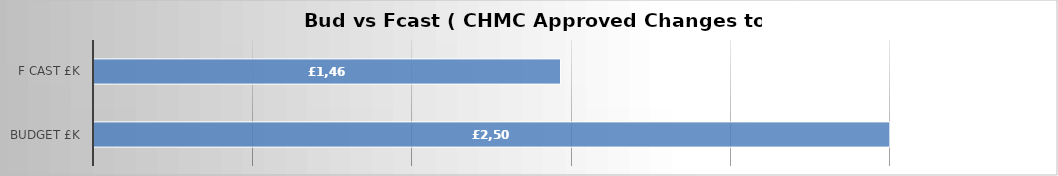
| Category | Series 0 |
|---|---|
| Budget £k | 2500 |
| F cast £k | 1465.619 |